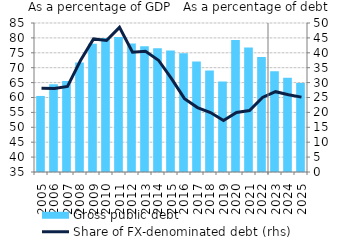
| Category | Gross public debt |
|---|---|
| 2005.0 | 60.518 |
| 2006.0 | 64.427 |
| 2007.0 | 65.55 |
| 2008.0 | 71.757 |
| 2009.0 | 78.032 |
| 2010.0 | 80.007 |
| 2011.0 | 80.338 |
| 2012.0 | 78.155 |
| 2013.0 | 77.198 |
| 2014.0 | 76.542 |
| 2015.0 | 75.76 |
| 2016.0 | 74.85 |
| 2017.0 | 72.114 |
| 2018.0 | 69.078 |
| 2019.0 | 65.346 |
| 2020.0 | 79.276 |
| 2021.0 | 76.771 |
| 2022.0 | 73.569 |
| 2023.0 | 68.849 |
| 2024.0 | 66.602 |
| 2025.0 | 64.848 |